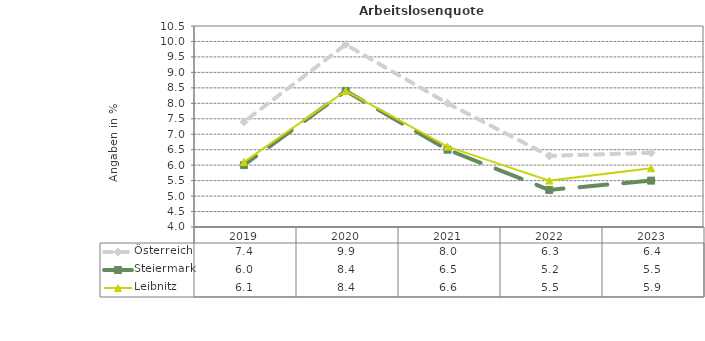
| Category | Österreich | Steiermark | Leibnitz |
|---|---|---|---|
| 2023.0 | 6.4 | 5.5 | 5.9 |
| 2022.0 | 6.3 | 5.2 | 5.5 |
| 2021.0 | 8 | 6.5 | 6.6 |
| 2020.0 | 9.9 | 8.4 | 8.4 |
| 2019.0 | 7.4 | 6 | 6.1 |